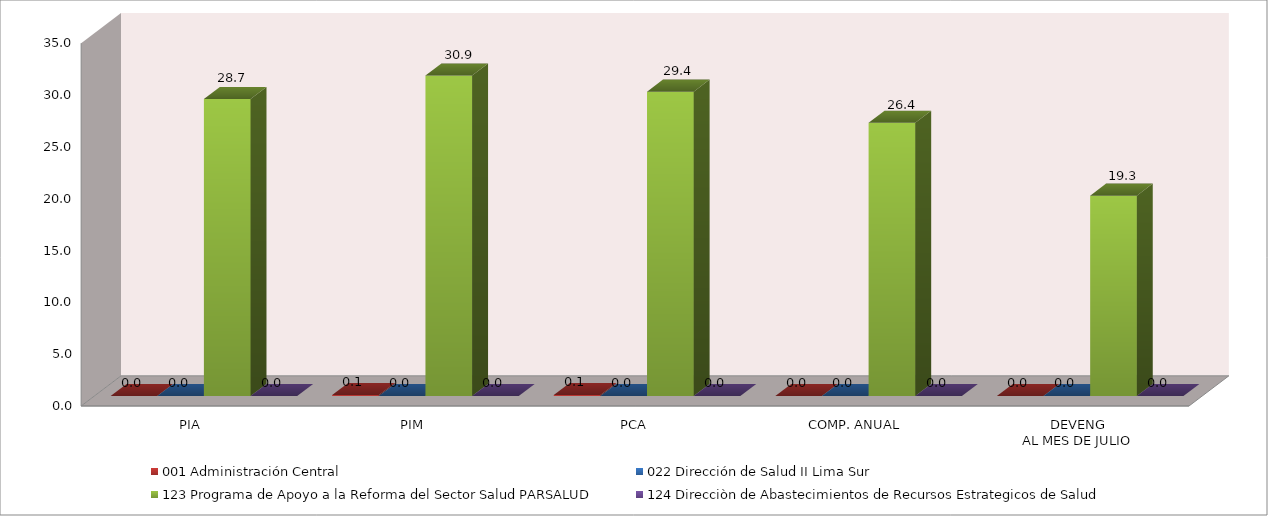
| Category | 001 Administración Central | 022 Dirección de Salud II Lima Sur | 123 Programa de Apoyo a la Reforma del Sector Salud PARSALUD | 124 Direcciòn de Abastecimientos de Recursos Estrategicos de Salud |
|---|---|---|---|---|
| PIA | 0 | 0 | 28.656 | 0 |
| PIM | 0.095 | 0 | 30.911 | 0 |
| PCA | 0.09 | 0 | 29.365 | 0 |
| COMP. ANUAL | 0 | 0 | 26.357 | 0 |
| DEVENG
AL MES DE JULIO | 0 | 0 | 19.329 | 0 |